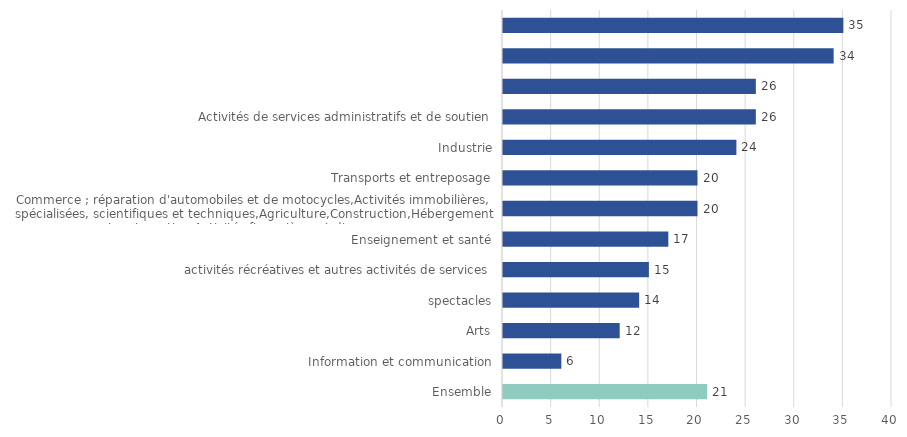
| Category | Series 0 |
|---|---|
| 0 | 21 |
| 1 | 6 |
| 2 | 12 |
| 3 | 14 |
| 4 | 15 |
| 5 | 17 |
| 6 | 20 |
| 7 | 20 |
| 8 | 24 |
| 9 | 26 |
| 10 | 26 |
| 11 | 34 |
| 12 | 35 |